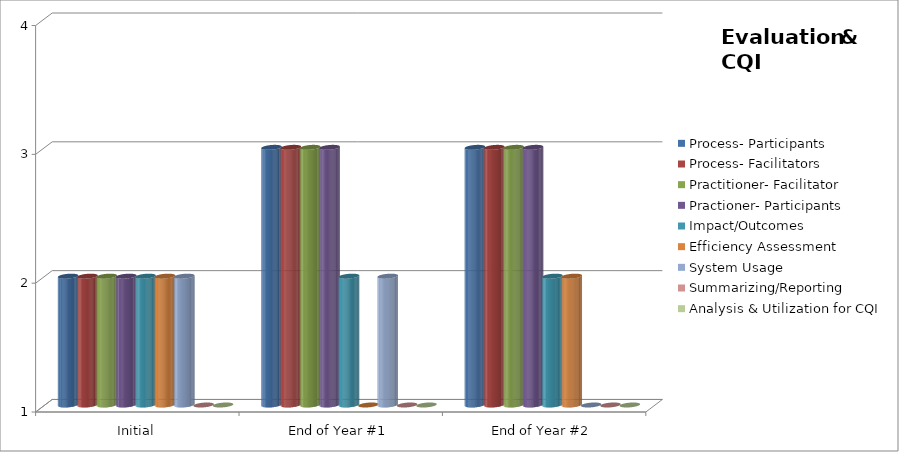
| Category | Process- Participants  | Process- Facilitators | Practitioner- Facilitator  | Practioner- Participants | Impact/Outcomes  | Efficiency Assessment  | System Usage  | Summarizing/Reporting | Analysis & Utilization for CQI |
|---|---|---|---|---|---|---|---|---|---|
| Initial | 2 | 2 | 2 | 2 | 2 | 2 | 2 | 1 | 1 |
| End of Year #1 | 3 | 3 | 3 | 3 | 2 | 1 | 2 | 1 | 1 |
| End of Year #2 | 3 | 3 | 3 | 3 | 2 | 2 | 1 | 1 | 1 |